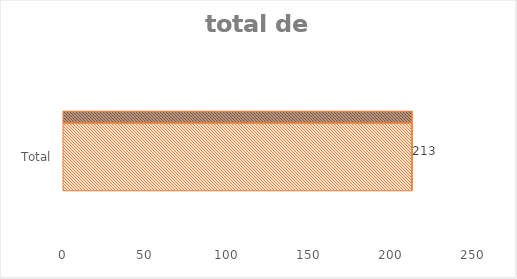
| Category | Total |
|---|---|
| Total | 213 |